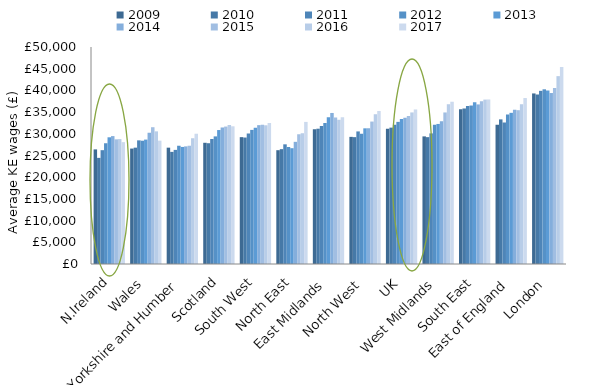
| Category | 2009 | 2010 | 2011 | 2012 | 2013 | 2014 | 2015 | 2016 | 2017 |
|---|---|---|---|---|---|---|---|---|---|
| N.Ireland | 26406 | 24455 | 26226 | 27824 | 29196 | 29469 | 28724 | 28778 | 28079 |
| Wales | 26595 | 26808 | 28489 | 28404 | 28664 | 30234 | 31516 | 30564 | 28422 |
| Yorkshire and Humber | 26805 | 25836 | 26291 | 27250 | 26977 | 27098 | 27252 | 28975 | 30000 |
| Scotland | 27930 | 27830 | 28797 | 29402 | 30865 | 31477 | 31667 | 32009 | 31730 |
| South West | 29228 | 29138 | 30058 | 30899 | 31403 | 31990 | 32078 | 31961 | 32463 |
| North East | 26222 | 26463 | 27575 | 26958 | 26682 | 28150 | 29894 | 30098 | 32741 |
| East Midlands | 31073 | 31174 | 31808 | 32484 | 33824 | 34801 | 33764 | 33229 | 33798 |
| North West | 29294 | 29230 | 30547 | 30011 | 31262 | 31267 | 32821 | 34496 | 35262 |
| UK | 31190 | 31421 | 32069 | 32750 | 33419 | 33698 | 34115 | 34924.352 | 35600.453 |
| West Midlands | 29403 | 29229 | 30093 | 32073 | 32270 | 32919 | 34919 | 36781 | 37389 |
| South East | 35628 | 35835 | 36423 | 36514 | 37287 | 36769 | 37490 | 37883 | 37921 |
| East of England | 32066 | 33322 | 32605 | 34471 | 34831 | 35514 | 35441 | 36823 | 38242 |
| London | 39300 | 39077 | 39900 | 40250 | 40000 | 39393 | 40546 | 43285 | 45417 |